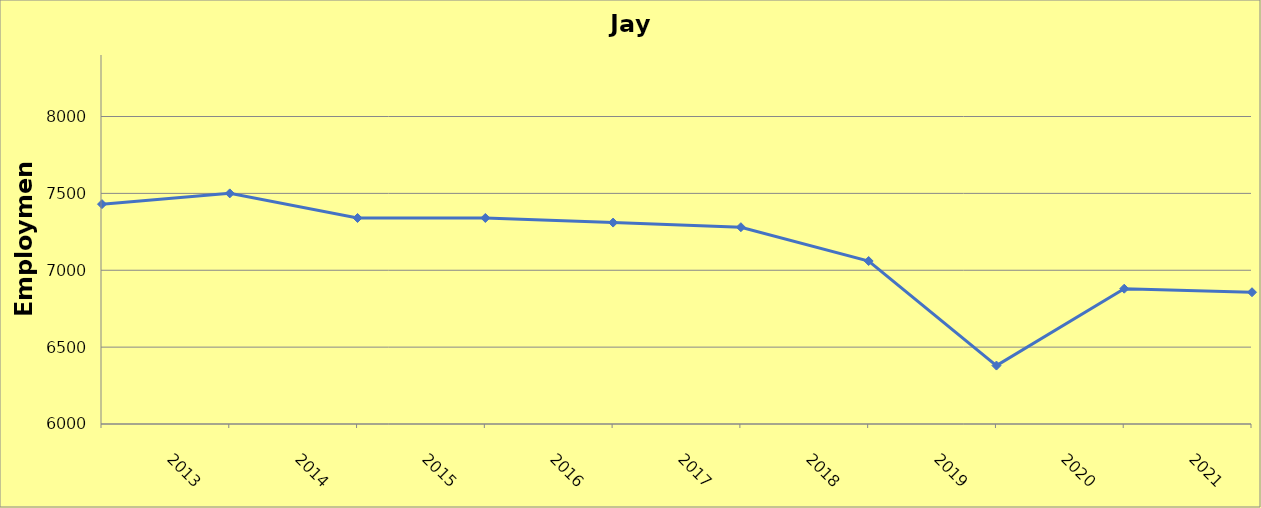
| Category | Jay County |
|---|---|
| 2013.0 | 7430 |
| 2014.0 | 7500 |
| 2015.0 | 7340 |
| 2016.0 | 7340 |
| 2017.0 | 7310 |
| 2018.0 | 7280 |
| 2019.0 | 7060 |
| 2020.0 | 6380 |
| 2021.0 | 6880 |
| 2022.0 | 6857 |